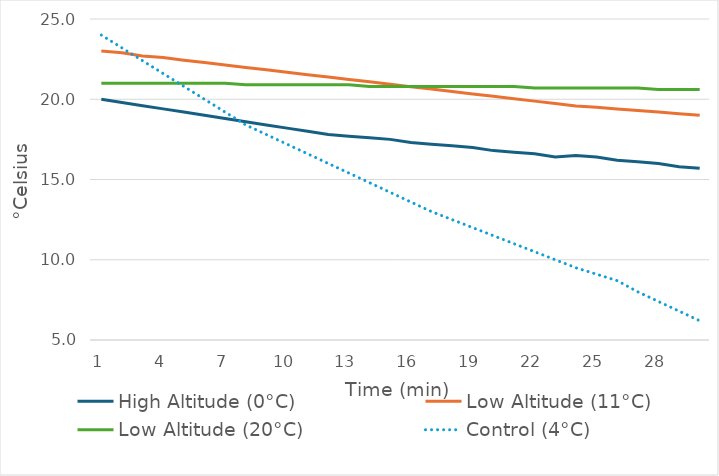
| Category | High Altitude (0°C) | Low Altitude (11°C) | Low Altitude (20°C) | Control (4°C) |
|---|---|---|---|---|
| 1.0 | 20 | 23 | 21 | 24 |
| 2.0 | 19.8 | 22.9 | 21 | 23.2 |
| 3.0 | 19.6 | 22.7 | 21 | 22.4 |
| 4.0 | 19.4 | 22.6 | 21 | 21.6 |
| 5.0 | 19.2 | 22.433 | 21 | 20.8 |
| 6.0 | 19 | 22.283 | 21 | 20 |
| 7.0 | 18.8 | 22.133 | 21 | 19.2 |
| 8.0 | 18.6 | 21.983 | 20.9 | 18.4 |
| 9.0 | 18.4 | 21.833 | 20.9 | 17.8 |
| 10.0 | 18.2 | 21.683 | 20.9 | 17.2 |
| 11.0 | 18 | 21.533 | 20.9 | 16.6 |
| 12.0 | 17.8 | 21.383 | 20.9 | 16 |
| 13.0 | 17.7 | 21.233 | 20.9 | 15.4 |
| 14.0 | 17.6 | 21.083 | 20.8 | 14.8 |
| 15.0 | 17.5 | 20.933 | 20.8 | 14.2 |
| 16.0 | 17.3 | 20.783 | 20.8 | 13.6 |
| 17.0 | 17.2 | 20.633 | 20.8 | 13 |
| 18.0 | 17.1 | 20.483 | 20.8 | 12.5 |
| 19.0 | 17 | 20.333 | 20.8 | 12 |
| 20.0 | 16.8 | 20.183 | 20.8 | 11.5 |
| 21.0 | 16.7 | 20.033 | 20.8 | 11 |
| 22.0 | 16.6 | 19.883 | 20.7 | 10.5 |
| 23.0 | 16.4 | 19.733 | 20.7 | 10 |
| 24.0 | 16.5 | 19.583 | 20.7 | 9.5 |
| 25.0 | 16.4 | 19.5 | 20.7 | 9.1 |
| 26.0 | 16.2 | 19.4 | 20.7 | 8.7 |
| 27.0 | 16.1 | 19.3 | 20.7 | 8 |
| 28.0 | 16 | 19.2 | 20.6 | 7.4 |
| 29.0 | 15.8 | 19.1 | 20.6 | 6.8 |
| 30.0 | 15.7 | 19 | 20.6 | 6.2 |